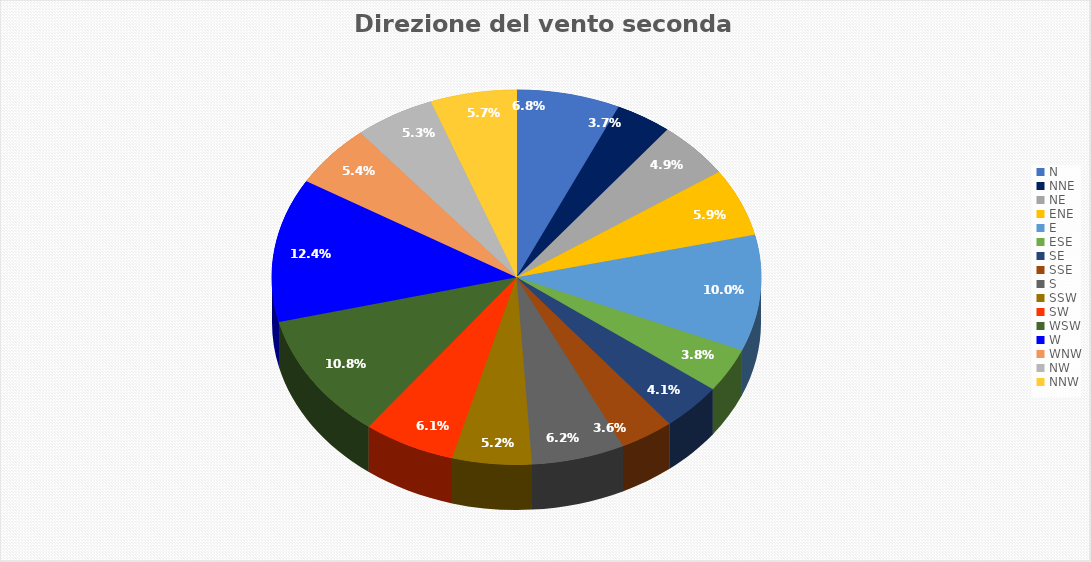
| Category | Percentuale |
|---|---|
| N | 6.845 |
| NNE | 3.718 |
| NE | 4.934 |
| ENE | 5.872 |
| E | 10.007 |
| ESE | 3.822 |
| SE | 4.065 |
| SSE | 3.579 |
| S | 6.15 |
| SSW | 5.247 |
| SW | 6.081 |
| WSW | 10.841 |
| W | 12.404 |
| WNW | 5.42 |
| NW | 5.316 |
| NNW | 5.698 |